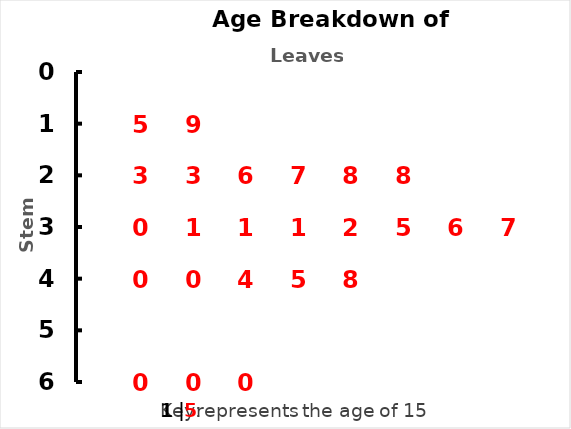
| Category | Series 0 |
|---|---|
| 1.0 | 1 |
| 2.0 | 1 |
| 1.0 | 2 |
| 2.0 | 2 |
| 3.0 | 2 |
| 4.0 | 2 |
| 5.0 | 2 |
| 6.0 | 2 |
| 1.0 | 3 |
| 2.0 | 3 |
| 3.0 | 3 |
| 4.0 | 3 |
| 5.0 | 3 |
| 6.0 | 3 |
| 7.0 | 3 |
| 8.0 | 3 |
| 1.0 | 4 |
| 2.0 | 4 |
| 3.0 | 4 |
| 4.0 | 4 |
| 5.0 | 4 |
| 1.0 | 6 |
| 2.0 | 6 |
| 3.0 | 6 |